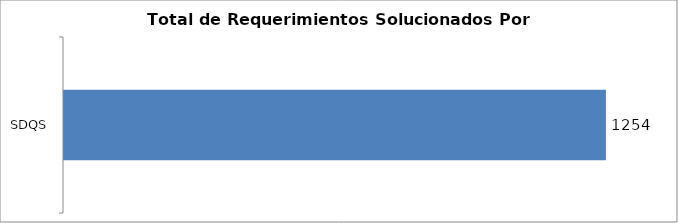
| Category | Total |
|---|---|
| SDQS | 1254 |